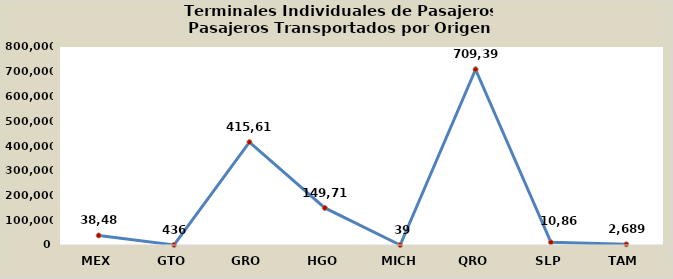
| Category | TOTAL |
|---|---|
| MEX | 38481 |
| GTO | 436 |
| GRO | 415610 |
| HGO | 149712 |
| MICH | 39 |
| QRO | 709393 |
| SLP | 10867 |
| TAM | 2689 |